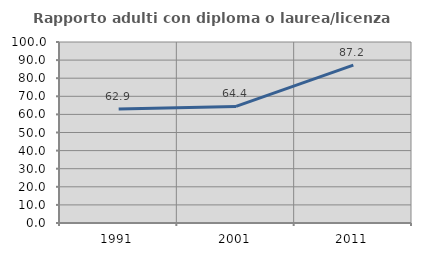
| Category | Rapporto adulti con diploma o laurea/licenza media  |
|---|---|
| 1991.0 | 62.931 |
| 2001.0 | 64.394 |
| 2011.0 | 87.234 |